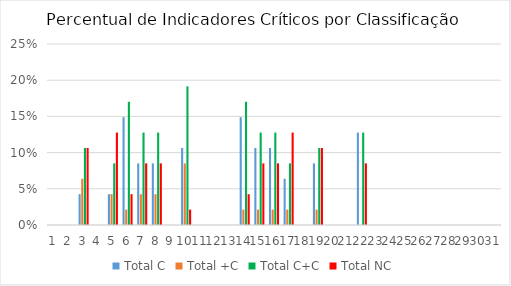
| Category | Total C | Total +C | Total C+C | Total NC |
|---|---|---|---|---|
| 0 | 0 | 0 | 0 | 0 |
| 1 | 0 | 0 | 0 | 0 |
| 2 | 0.043 | 0.064 | 0.106 | 0.106 |
| 3 | 0 | 0 | 0 | 0 |
| 4 | 0.043 | 0.043 | 0.085 | 0.128 |
| 5 | 0.149 | 0.021 | 0.17 | 0.043 |
| 6 | 0.085 | 0.043 | 0.128 | 0.085 |
| 7 | 0.085 | 0.043 | 0.128 | 0.085 |
| 8 | 0 | 0 | 0 | 0 |
| 9 | 0.106 | 0.085 | 0.191 | 0.021 |
| 10 | 0 | 0 | 0 | 0 |
| 11 | 0 | 0 | 0 | 0 |
| 12 | 0 | 0 | 0 | 0 |
| 13 | 0.149 | 0.021 | 0.17 | 0.043 |
| 14 | 0.106 | 0.021 | 0.128 | 0.085 |
| 15 | 0.106 | 0.021 | 0.128 | 0.085 |
| 16 | 0.064 | 0.021 | 0.085 | 0.128 |
| 17 | 0 | 0 | 0 | 0 |
| 18 | 0.085 | 0.021 | 0.106 | 0.106 |
| 19 | 0 | 0 | 0 | 0 |
| 20 | 0 | 0 | 0 | 0 |
| 21 | 0.128 | 0 | 0.128 | 0.085 |
| 22 | 0 | 0 | 0 | 0 |
| 23 | 0 | 0 | 0 | 0 |
| 24 | 0 | 0 | 0 | 0 |
| 25 | 0 | 0 | 0 | 0 |
| 26 | 0 | 0 | 0 | 0 |
| 27 | 0 | 0 | 0 | 0 |
| 28 | 0 | 0 | 0 | 0 |
| 29 | 0 | 0 | 0 | 0 |
| 30 | 0 | 0 | 0 | 0 |